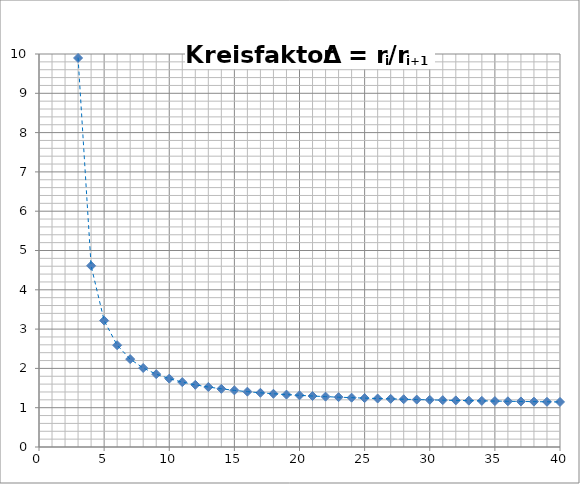
| Category | Series 0 |
|---|---|
| 3.0 | 9.899 |
| 4.0 | 4.612 |
| 5.0 | 3.217 |
| 6.0 | 2.59 |
| 7.0 | 2.237 |
| 8.0 | 2.011 |
| 9.0 | 1.854 |
| 10.0 | 1.739 |
| 11.0 | 1.651 |
| 12.0 | 1.582 |
| 13.0 | 1.526 |
| 14.0 | 1.48 |
| 15.0 | 1.441 |
| 16.0 | 1.408 |
| 17.0 | 1.38 |
| 18.0 | 1.355 |
| 19.0 | 1.333 |
| 20.0 | 1.314 |
| 21.0 | 1.297 |
| 22.0 | 1.282 |
| 23.0 | 1.268 |
| 24.0 | 1.255 |
| 25.0 | 1.244 |
| 26.0 | 1.233 |
| 27.0 | 1.224 |
| 28.0 | 1.215 |
| 29.0 | 1.207 |
| 30.0 | 1.199 |
| 31.0 | 1.192 |
| 32.0 | 1.186 |
| 33.0 | 1.18 |
| 34.0 | 1.174 |
| 35.0 | 1.168 |
| 36.0 | 1.163 |
| 37.0 | 1.159 |
| 38.0 | 1.154 |
| 39.0 | 1.15 |
| 40.0 | 1.146 |